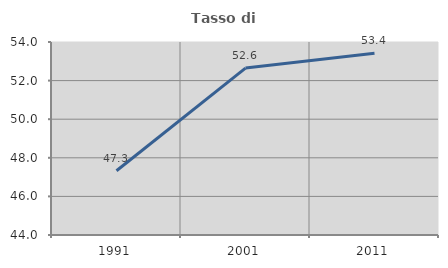
| Category | Tasso di occupazione   |
|---|---|
| 1991.0 | 47.331 |
| 2001.0 | 52.649 |
| 2011.0 | 53.423 |